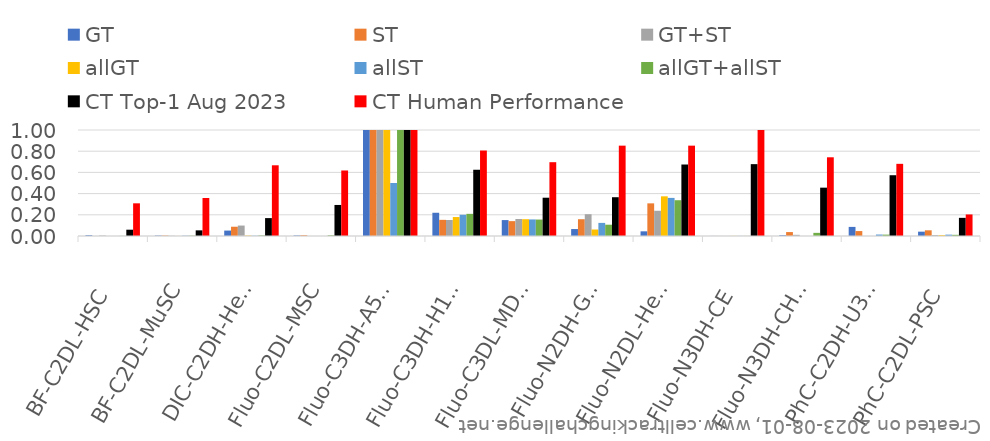
| Category | GT | ST | GT+ST | allGT | allST | allGT+allST | CT Top-1 Aug 2023 | CT Human Performance |
|---|---|---|---|---|---|---|---|---|
| BF-C2DL-HSC | 0.007 | 0 | 0.004 | 0 | 0 | 0.001 | 0.059 | 0.308 |
| BF-C2DL-MuSC | 0.004 | 0.004 | 0.002 | 0 | 0.003 | 0.003 | 0.053 | 0.358 |
| DIC-C2DH-HeLa | 0.051 | 0.087 | 0.099 | 0.004 | 0.002 | 0.005 | 0.169 | 0.667 |
| Fluo-C2DL-MSC | 0.005 | 0.007 | 0 | 0 | 0 | 0.006 | 0.293 | 0.618 |
| Fluo-C3DH-A549 | 1 | 1 | 1 | 1 | 0.5 | 1 | 1 | 1 |
| Fluo-C3DH-H157 | 0.219 | 0.152 | 0.151 | 0.179 | 0.2 | 0.209 | 0.625 | 0.806 |
| Fluo-C3DL-MDA231 | 0.15 | 0.14 | 0.16 | 0.158 | 0.156 | 0.155 | 0.361 | 0.696 |
| Fluo-N2DH-GOWT1 | 0.066 | 0.158 | 0.206 | 0.061 | 0.124 | 0.107 | 0.366 | 0.852 |
| Fluo-N2DL-HeLa | 0.044 | 0.308 | 0.238 | 0.374 | 0.359 | 0.338 | 0.674 | 0.852 |
| Fluo-N3DH-CE | 0.001 | 0 | 0 | 0.001 | 0.001 | 0.001 | 0.678 | 1 |
| Fluo-N3DH-CHO | 0.007 | 0.037 | 0.011 | 0 | 0 | 0.03 | 0.456 | 0.743 |
| PhC-C2DH-U373 | 0.086 | 0.047 | 0 | 0 | 0.014 | 0.013 | 0.573 | 0.681 |
| PhC-C2DL-PSC | 0.041 | 0.054 | 0.009 | 0.009 | 0.013 | 0.011 | 0.171 | 0.203 |